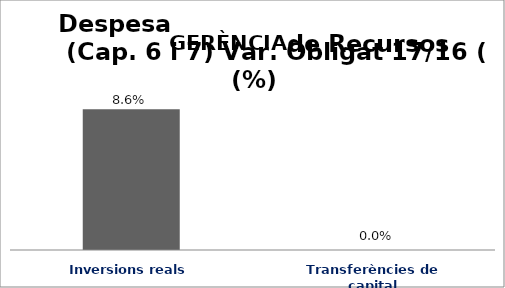
| Category | Series 0 |
|---|---|
| Inversions reals | 0.086 |
| Transferències de capital | 0 |